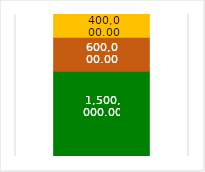
| Category | Series 3 | Series 0 | Series 1 | Series 2 |
|---|---|---|---|---|
| 0 |  | 1500000 | 600000 | 400000 |